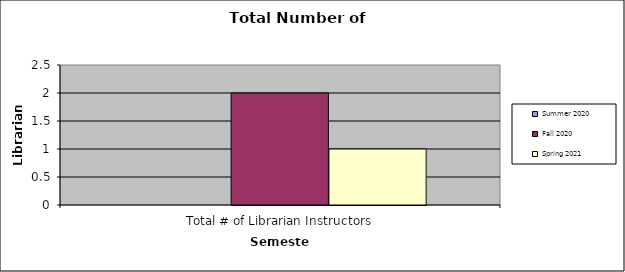
| Category | Summer 2020 | Fall 2020 | Spring 2021 |
|---|---|---|---|
| Total # of Librarian Instructors | 0 | 2 | 1 |